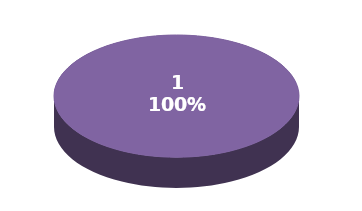
| Category | Series 1 |
|---|---|
| 0 | 11 |